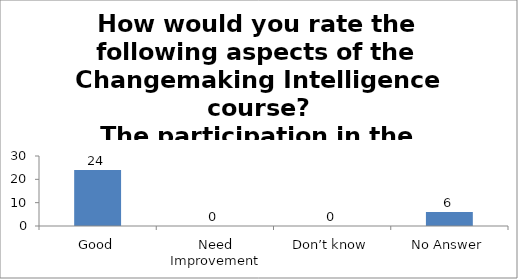
| Category | How would you rate the following aspects of the Changemaking Intelligence course?
The participation in the Changemaking Intelligence Test as a team. |
|---|---|
| Good | 24 |
| Need Improvement | 0 |
| Don’t know | 0 |
| No Answer | 6 |